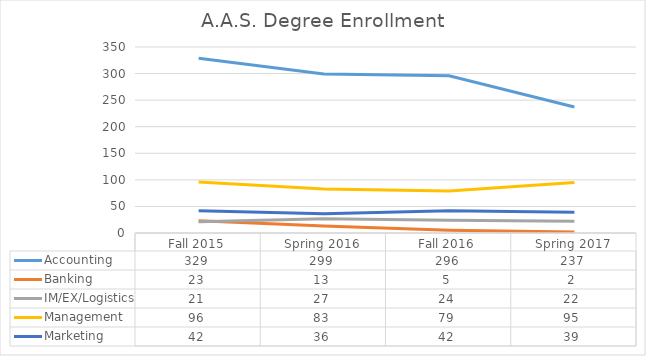
| Category | Accounting | Banking | IM/EX/Logistics | Management | Marketing |
|---|---|---|---|---|---|
| Fall 2015 | 329 | 23 | 21 | 96 | 42 |
| Spring 2016 | 299 | 13 | 27 | 83 | 36 |
| Fall 2016 | 296 | 5 | 24 | 79 | 42 |
| Spring 2017 | 237 | 2 | 22 | 95 | 39 |